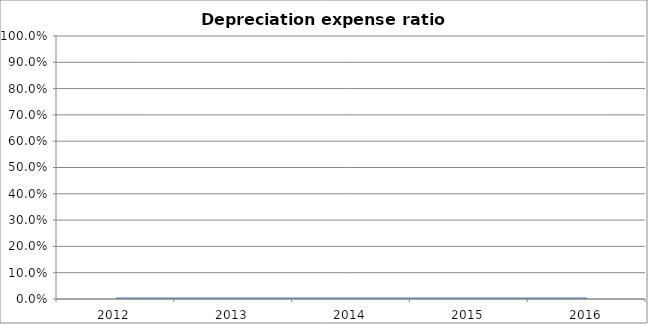
| Category | Depreciation expense ratio [L/H] |
|---|---|
| 2012.0 | 0 |
| 2013.0 | 0 |
| 2014.0 | 0 |
| 2015.0 | 0 |
| 2016.0 | 0 |